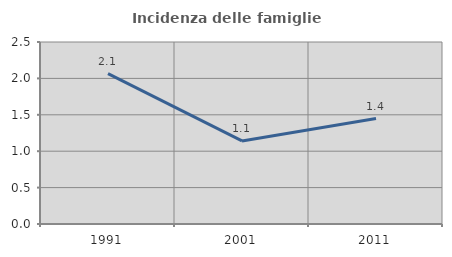
| Category | Incidenza delle famiglie numerose |
|---|---|
| 1991.0 | 2.066 |
| 2001.0 | 1.141 |
| 2011.0 | 1.448 |